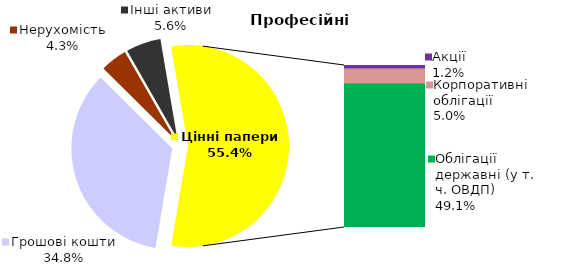
| Category | Професійні |
|---|---|
| Грошові кошти | 56.686 |
| Банківські метали | 0 |
| Нерухомість | 7.006 |
| Інші активи | 9.133 |
| Акції | 2.035 |
| Корпоративні облігації | 8.197 |
| Облігації місцевих рад | 0 |
| Облігації державні (у т. ч. ОВДП) | 80.067 |